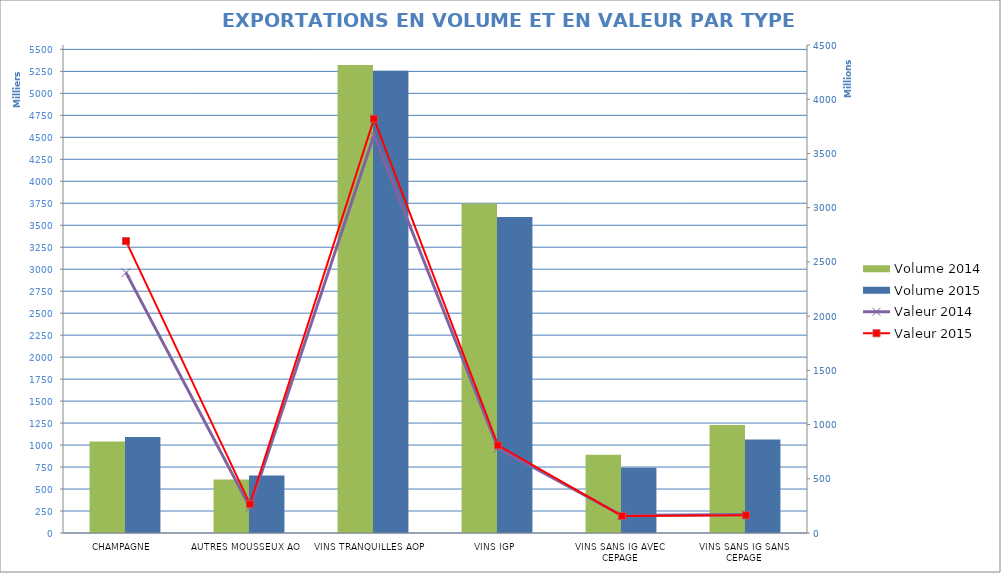
| Category | Volume 2014 | Volume 2015 |
|---|---|---|
| CHAMPAGNE | 1040377.41 | 1090520.91 |
| AUTRES MOUSSEUX AO | 607593.69 | 653280.66 |
| VINS TRANQUILLES AOP | 5321196.9 | 5257297.62 |
| VINS IGP | 3747536.28 | 3594478.68 |
| VINS SANS IG AVEC CEPAGE | 888562.26 | 740923.02 |
| VINS SANS IG SANS CEPAGE | 1228478.13 | 1062612.09 |